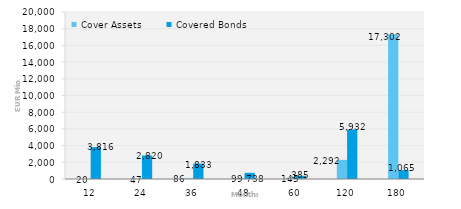
| Category | Cover Assets | Covered Bonds |
|---|---|---|
| 12.0 | 19.646 | 3816 |
| 24.0 | 46.847 | 2820.286 |
| 36.0 | 86.236 | 1832.5 |
| 48.0 | 99.459 | 737.5 |
| 60.0 | 145.041 | 385 |
| 120.0 | 2292.251 | 5932.016 |
| 180.0 | 17301.769 | 1065.256 |